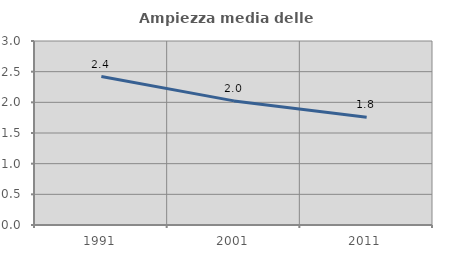
| Category | Ampiezza media delle famiglie |
|---|---|
| 1991.0 | 2.42 |
| 2001.0 | 2.023 |
| 2011.0 | 1.757 |